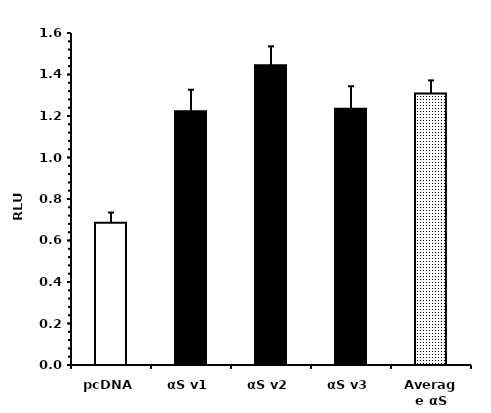
| Category | Series 0 |
|---|---|
| pcDNA | 0.685 |
| αS v1 | 1.223 |
| αS v2 | 1.445 |
| αS v3 | 1.235 |
| Average αS | 1.308 |